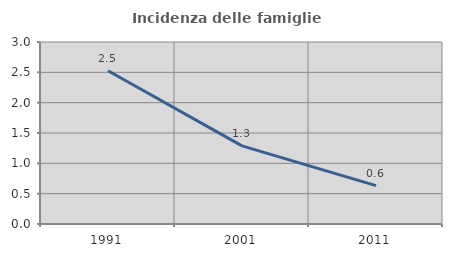
| Category | Incidenza delle famiglie numerose |
|---|---|
| 1991.0 | 2.527 |
| 2001.0 | 1.287 |
| 2011.0 | 0.633 |